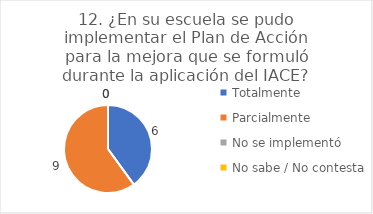
| Category | 12. ¿En su escuela se pudo implementar el Plan de Acción para la mejora que se formuló durante la aplicación del IACE? |
|---|---|
| Totalmente  | 0.4 |
| Parcialmente  | 0.6 |
| No se implementó  | 0 |
| No sabe / No contesta | 0 |